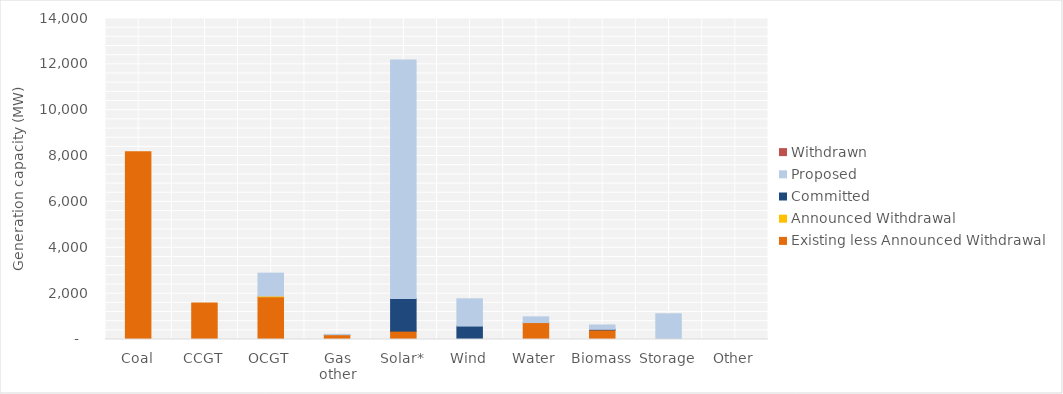
| Category | Existing less Announced Withdrawal | Announced Withdrawal | Committed | Proposed | Withdrawn |
|---|---|---|---|---|---|
| Coal | 8186 | 0 | 0 | 0 | 0 |
| CCGT | 1595.5 | 0 | 0 | 0 | 0 |
| OCGT | 1860.5 | 34 | 0 | 1000 | 0 |
| Gas other | 208.37 | 0 | 0 | 15.205 | 0 |
| Solar* | 364.927 | 0 | 1422 | 10400.227 | 0 |
| Wind | 12 | 0 | 573.7 | 1188.4 | 0 |
| Water | 738.2 | 0 | 0 | 250 | 0 |
| Biomass | 419.19 | 0 | 24 | 189.6 | 0 |
| Storage | 0 | 0 | 2 | 1120 | 0 |
| Other | 1 | 0 | 0 | 0 | 0 |